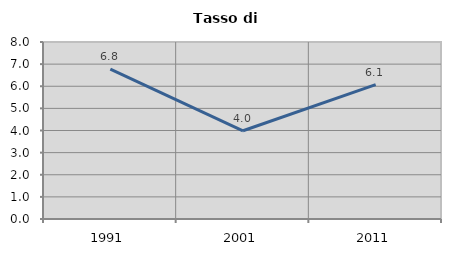
| Category | Tasso di disoccupazione   |
|---|---|
| 1991.0 | 6.771 |
| 2001.0 | 3.988 |
| 2011.0 | 6.07 |